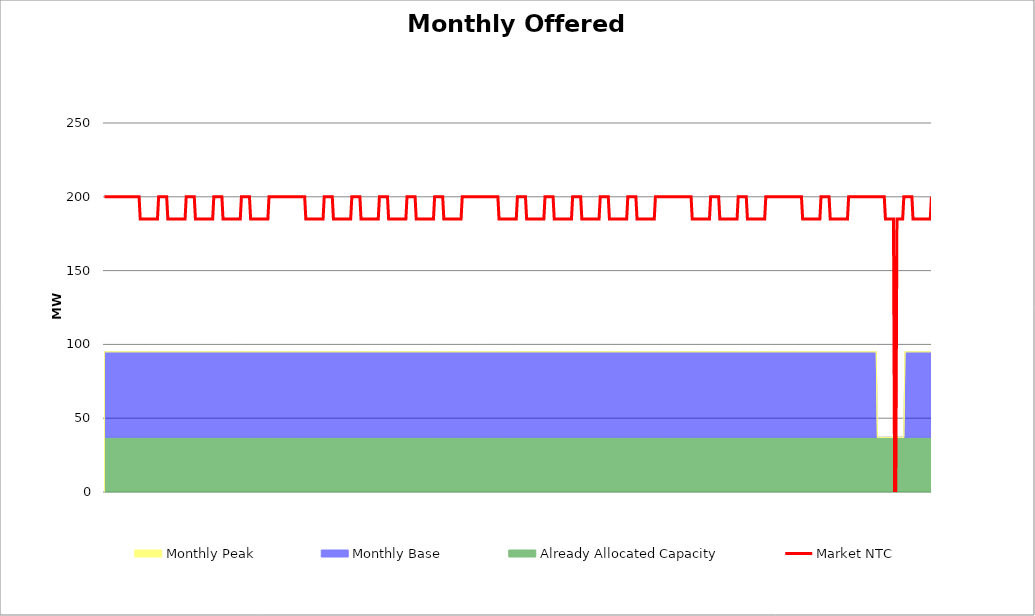
| Category | Market NTC |
|---|---|
| 0 | 200 |
| 1 | 200 |
| 2 | 200 |
| 3 | 200 |
| 4 | 200 |
| 5 | 200 |
| 6 | 200 |
| 7 | 200 |
| 8 | 200 |
| 9 | 200 |
| 10 | 200 |
| 11 | 200 |
| 12 | 200 |
| 13 | 200 |
| 14 | 200 |
| 15 | 200 |
| 16 | 200 |
| 17 | 200 |
| 18 | 200 |
| 19 | 200 |
| 20 | 200 |
| 21 | 200 |
| 22 | 200 |
| 23 | 200 |
| 24 | 200 |
| 25 | 200 |
| 26 | 200 |
| 27 | 200 |
| 28 | 200 |
| 29 | 200 |
| 30 | 200 |
| 31 | 185 |
| 32 | 185 |
| 33 | 185 |
| 34 | 185 |
| 35 | 185 |
| 36 | 185 |
| 37 | 185 |
| 38 | 185 |
| 39 | 185 |
| 40 | 185 |
| 41 | 185 |
| 42 | 185 |
| 43 | 185 |
| 44 | 185 |
| 45 | 185 |
| 46 | 185 |
| 47 | 200 |
| 48 | 200 |
| 49 | 200 |
| 50 | 200 |
| 51 | 200 |
| 52 | 200 |
| 53 | 200 |
| 54 | 200 |
| 55 | 185 |
| 56 | 185 |
| 57 | 185 |
| 58 | 185 |
| 59 | 185 |
| 60 | 185 |
| 61 | 185 |
| 62 | 185 |
| 63 | 185 |
| 64 | 185 |
| 65 | 185 |
| 66 | 185 |
| 67 | 185 |
| 68 | 185 |
| 69 | 185 |
| 70 | 185 |
| 71 | 200 |
| 72 | 200 |
| 73 | 200 |
| 74 | 200 |
| 75 | 200 |
| 76 | 200 |
| 77 | 200 |
| 78 | 200 |
| 79 | 185 |
| 80 | 185 |
| 81 | 185 |
| 82 | 185 |
| 83 | 185 |
| 84 | 185 |
| 85 | 185 |
| 86 | 185 |
| 87 | 185 |
| 88 | 185 |
| 89 | 185 |
| 90 | 185 |
| 91 | 185 |
| 92 | 185 |
| 93 | 185 |
| 94 | 185 |
| 95 | 200 |
| 96 | 200 |
| 97 | 200 |
| 98 | 200 |
| 99 | 200 |
| 100 | 200 |
| 101 | 200 |
| 102 | 200 |
| 103 | 185 |
| 104 | 185 |
| 105 | 185 |
| 106 | 185 |
| 107 | 185 |
| 108 | 185 |
| 109 | 185 |
| 110 | 185 |
| 111 | 185 |
| 112 | 185 |
| 113 | 185 |
| 114 | 185 |
| 115 | 185 |
| 116 | 185 |
| 117 | 185 |
| 118 | 185 |
| 119 | 200 |
| 120 | 200 |
| 121 | 200 |
| 122 | 200 |
| 123 | 200 |
| 124 | 200 |
| 125 | 200 |
| 126 | 200 |
| 127 | 185 |
| 128 | 185 |
| 129 | 185 |
| 130 | 185 |
| 131 | 185 |
| 132 | 185 |
| 133 | 185 |
| 134 | 185 |
| 135 | 185 |
| 136 | 185 |
| 137 | 185 |
| 138 | 185 |
| 139 | 185 |
| 140 | 185 |
| 141 | 185 |
| 142 | 185 |
| 143 | 200 |
| 144 | 200 |
| 145 | 200 |
| 146 | 200 |
| 147 | 200 |
| 148 | 200 |
| 149 | 200 |
| 150 | 200 |
| 151 | 200 |
| 152 | 200 |
| 153 | 200 |
| 154 | 200 |
| 155 | 200 |
| 156 | 200 |
| 157 | 200 |
| 158 | 200 |
| 159 | 200 |
| 160 | 200 |
| 161 | 200 |
| 162 | 200 |
| 163 | 200 |
| 164 | 200 |
| 165 | 200 |
| 166 | 200 |
| 167 | 200 |
| 168 | 200 |
| 169 | 200 |
| 170 | 200 |
| 171 | 200 |
| 172 | 200 |
| 173 | 200 |
| 174 | 200 |
| 175 | 185 |
| 176 | 185 |
| 177 | 185 |
| 178 | 185 |
| 179 | 185 |
| 180 | 185 |
| 181 | 185 |
| 182 | 185 |
| 183 | 185 |
| 184 | 185 |
| 185 | 185 |
| 186 | 185 |
| 187 | 185 |
| 188 | 185 |
| 189 | 185 |
| 190 | 185 |
| 191 | 200 |
| 192 | 200 |
| 193 | 200 |
| 194 | 200 |
| 195 | 200 |
| 196 | 200 |
| 197 | 200 |
| 198 | 200 |
| 199 | 185 |
| 200 | 185 |
| 201 | 185 |
| 202 | 185 |
| 203 | 185 |
| 204 | 185 |
| 205 | 185 |
| 206 | 185 |
| 207 | 185 |
| 208 | 185 |
| 209 | 185 |
| 210 | 185 |
| 211 | 185 |
| 212 | 185 |
| 213 | 185 |
| 214 | 185 |
| 215 | 200 |
| 216 | 200 |
| 217 | 200 |
| 218 | 200 |
| 219 | 200 |
| 220 | 200 |
| 221 | 200 |
| 222 | 200 |
| 223 | 185 |
| 224 | 185 |
| 225 | 185 |
| 226 | 185 |
| 227 | 185 |
| 228 | 185 |
| 229 | 185 |
| 230 | 185 |
| 231 | 185 |
| 232 | 185 |
| 233 | 185 |
| 234 | 185 |
| 235 | 185 |
| 236 | 185 |
| 237 | 185 |
| 238 | 185 |
| 239 | 200 |
| 240 | 200 |
| 241 | 200 |
| 242 | 200 |
| 243 | 200 |
| 244 | 200 |
| 245 | 200 |
| 246 | 200 |
| 247 | 185 |
| 248 | 185 |
| 249 | 185 |
| 250 | 185 |
| 251 | 185 |
| 252 | 185 |
| 253 | 185 |
| 254 | 185 |
| 255 | 185 |
| 256 | 185 |
| 257 | 185 |
| 258 | 185 |
| 259 | 185 |
| 260 | 185 |
| 261 | 185 |
| 262 | 185 |
| 263 | 200 |
| 264 | 200 |
| 265 | 200 |
| 266 | 200 |
| 267 | 200 |
| 268 | 200 |
| 269 | 200 |
| 270 | 200 |
| 271 | 185 |
| 272 | 185 |
| 273 | 185 |
| 274 | 185 |
| 275 | 185 |
| 276 | 185 |
| 277 | 185 |
| 278 | 185 |
| 279 | 185 |
| 280 | 185 |
| 281 | 185 |
| 282 | 185 |
| 283 | 185 |
| 284 | 185 |
| 285 | 185 |
| 286 | 185 |
| 287 | 200 |
| 288 | 200 |
| 289 | 200 |
| 290 | 200 |
| 291 | 200 |
| 292 | 200 |
| 293 | 200 |
| 294 | 200 |
| 295 | 185 |
| 296 | 185 |
| 297 | 185 |
| 298 | 185 |
| 299 | 185 |
| 300 | 185 |
| 301 | 185 |
| 302 | 185 |
| 303 | 185 |
| 304 | 185 |
| 305 | 185 |
| 306 | 185 |
| 307 | 185 |
| 308 | 185 |
| 309 | 185 |
| 310 | 185 |
| 311 | 200 |
| 312 | 200 |
| 313 | 200 |
| 314 | 200 |
| 315 | 200 |
| 316 | 200 |
| 317 | 200 |
| 318 | 200 |
| 319 | 200 |
| 320 | 200 |
| 321 | 200 |
| 322 | 200 |
| 323 | 200 |
| 324 | 200 |
| 325 | 200 |
| 326 | 200 |
| 327 | 200 |
| 328 | 200 |
| 329 | 200 |
| 330 | 200 |
| 331 | 200 |
| 332 | 200 |
| 333 | 200 |
| 334 | 200 |
| 335 | 200 |
| 336 | 200 |
| 337 | 200 |
| 338 | 200 |
| 339 | 200 |
| 340 | 200 |
| 341 | 200 |
| 342 | 200 |
| 343 | 185 |
| 344 | 185 |
| 345 | 185 |
| 346 | 185 |
| 347 | 185 |
| 348 | 185 |
| 349 | 185 |
| 350 | 185 |
| 351 | 185 |
| 352 | 185 |
| 353 | 185 |
| 354 | 185 |
| 355 | 185 |
| 356 | 185 |
| 357 | 185 |
| 358 | 185 |
| 359 | 200 |
| 360 | 200 |
| 361 | 200 |
| 362 | 200 |
| 363 | 200 |
| 364 | 200 |
| 365 | 200 |
| 366 | 200 |
| 367 | 185 |
| 368 | 185 |
| 369 | 185 |
| 370 | 185 |
| 371 | 185 |
| 372 | 185 |
| 373 | 185 |
| 374 | 185 |
| 375 | 185 |
| 376 | 185 |
| 377 | 185 |
| 378 | 185 |
| 379 | 185 |
| 380 | 185 |
| 381 | 185 |
| 382 | 185 |
| 383 | 200 |
| 384 | 200 |
| 385 | 200 |
| 386 | 200 |
| 387 | 200 |
| 388 | 200 |
| 389 | 200 |
| 390 | 200 |
| 391 | 185 |
| 392 | 185 |
| 393 | 185 |
| 394 | 185 |
| 395 | 185 |
| 396 | 185 |
| 397 | 185 |
| 398 | 185 |
| 399 | 185 |
| 400 | 185 |
| 401 | 185 |
| 402 | 185 |
| 403 | 185 |
| 404 | 185 |
| 405 | 185 |
| 406 | 185 |
| 407 | 200 |
| 408 | 200 |
| 409 | 200 |
| 410 | 200 |
| 411 | 200 |
| 412 | 200 |
| 413 | 200 |
| 414 | 200 |
| 415 | 185 |
| 416 | 185 |
| 417 | 185 |
| 418 | 185 |
| 419 | 185 |
| 420 | 185 |
| 421 | 185 |
| 422 | 185 |
| 423 | 185 |
| 424 | 185 |
| 425 | 185 |
| 426 | 185 |
| 427 | 185 |
| 428 | 185 |
| 429 | 185 |
| 430 | 185 |
| 431 | 200 |
| 432 | 200 |
| 433 | 200 |
| 434 | 200 |
| 435 | 200 |
| 436 | 200 |
| 437 | 200 |
| 438 | 200 |
| 439 | 185 |
| 440 | 185 |
| 441 | 185 |
| 442 | 185 |
| 443 | 185 |
| 444 | 185 |
| 445 | 185 |
| 446 | 185 |
| 447 | 185 |
| 448 | 185 |
| 449 | 185 |
| 450 | 185 |
| 451 | 185 |
| 452 | 185 |
| 453 | 185 |
| 454 | 185 |
| 455 | 200 |
| 456 | 200 |
| 457 | 200 |
| 458 | 200 |
| 459 | 200 |
| 460 | 200 |
| 461 | 200 |
| 462 | 200 |
| 463 | 185 |
| 464 | 185 |
| 465 | 185 |
| 466 | 185 |
| 467 | 185 |
| 468 | 185 |
| 469 | 185 |
| 470 | 185 |
| 471 | 185 |
| 472 | 185 |
| 473 | 185 |
| 474 | 185 |
| 475 | 185 |
| 476 | 185 |
| 477 | 185 |
| 478 | 185 |
| 479 | 200 |
| 480 | 200 |
| 481 | 200 |
| 482 | 200 |
| 483 | 200 |
| 484 | 200 |
| 485 | 200 |
| 486 | 200 |
| 487 | 200 |
| 488 | 200 |
| 489 | 200 |
| 490 | 200 |
| 491 | 200 |
| 492 | 200 |
| 493 | 200 |
| 494 | 200 |
| 495 | 200 |
| 496 | 200 |
| 497 | 200 |
| 498 | 200 |
| 499 | 200 |
| 500 | 200 |
| 501 | 200 |
| 502 | 200 |
| 503 | 200 |
| 504 | 200 |
| 505 | 200 |
| 506 | 200 |
| 507 | 200 |
| 508 | 200 |
| 509 | 200 |
| 510 | 200 |
| 511 | 185 |
| 512 | 185 |
| 513 | 185 |
| 514 | 185 |
| 515 | 185 |
| 516 | 185 |
| 517 | 185 |
| 518 | 185 |
| 519 | 185 |
| 520 | 185 |
| 521 | 185 |
| 522 | 185 |
| 523 | 185 |
| 524 | 185 |
| 525 | 185 |
| 526 | 185 |
| 527 | 200 |
| 528 | 200 |
| 529 | 200 |
| 530 | 200 |
| 531 | 200 |
| 532 | 200 |
| 533 | 200 |
| 534 | 200 |
| 535 | 185 |
| 536 | 185 |
| 537 | 185 |
| 538 | 185 |
| 539 | 185 |
| 540 | 185 |
| 541 | 185 |
| 542 | 185 |
| 543 | 185 |
| 544 | 185 |
| 545 | 185 |
| 546 | 185 |
| 547 | 185 |
| 548 | 185 |
| 549 | 185 |
| 550 | 185 |
| 551 | 200 |
| 552 | 200 |
| 553 | 200 |
| 554 | 200 |
| 555 | 200 |
| 556 | 200 |
| 557 | 200 |
| 558 | 200 |
| 559 | 185 |
| 560 | 185 |
| 561 | 185 |
| 562 | 185 |
| 563 | 185 |
| 564 | 185 |
| 565 | 185 |
| 566 | 185 |
| 567 | 185 |
| 568 | 185 |
| 569 | 185 |
| 570 | 185 |
| 571 | 185 |
| 572 | 185 |
| 573 | 185 |
| 574 | 185 |
| 575 | 200 |
| 576 | 200 |
| 577 | 200 |
| 578 | 200 |
| 579 | 200 |
| 580 | 200 |
| 581 | 200 |
| 582 | 200 |
| 583 | 200 |
| 584 | 200 |
| 585 | 200 |
| 586 | 200 |
| 587 | 200 |
| 588 | 200 |
| 589 | 200 |
| 590 | 200 |
| 591 | 200 |
| 592 | 200 |
| 593 | 200 |
| 594 | 200 |
| 595 | 200 |
| 596 | 200 |
| 597 | 200 |
| 598 | 200 |
| 599 | 200 |
| 600 | 200 |
| 601 | 200 |
| 602 | 200 |
| 603 | 200 |
| 604 | 200 |
| 605 | 200 |
| 606 | 200 |
| 607 | 185 |
| 608 | 185 |
| 609 | 185 |
| 610 | 185 |
| 611 | 185 |
| 612 | 185 |
| 613 | 185 |
| 614 | 185 |
| 615 | 185 |
| 616 | 185 |
| 617 | 185 |
| 618 | 185 |
| 619 | 185 |
| 620 | 185 |
| 621 | 185 |
| 622 | 185 |
| 623 | 200 |
| 624 | 200 |
| 625 | 200 |
| 626 | 200 |
| 627 | 200 |
| 628 | 200 |
| 629 | 200 |
| 630 | 200 |
| 631 | 185 |
| 632 | 185 |
| 633 | 185 |
| 634 | 185 |
| 635 | 185 |
| 636 | 185 |
| 637 | 185 |
| 638 | 185 |
| 639 | 185 |
| 640 | 185 |
| 641 | 185 |
| 642 | 185 |
| 643 | 185 |
| 644 | 185 |
| 645 | 185 |
| 646 | 185 |
| 647 | 200 |
| 648 | 200 |
| 649 | 200 |
| 650 | 200 |
| 651 | 200 |
| 652 | 200 |
| 653 | 200 |
| 654 | 200 |
| 655 | 200 |
| 656 | 200 |
| 657 | 200 |
| 658 | 200 |
| 659 | 200 |
| 660 | 200 |
| 661 | 200 |
| 662 | 200 |
| 663 | 200 |
| 664 | 200 |
| 665 | 200 |
| 666 | 200 |
| 667 | 200 |
| 668 | 200 |
| 669 | 200 |
| 670 | 200 |
| 671 | 200 |
| 672 | 200 |
| 673 | 200 |
| 674 | 200 |
| 675 | 200 |
| 676 | 200 |
| 677 | 200 |
| 678 | 200 |
| 679 | 185 |
| 680 | 185 |
| 681 | 185 |
| 682 | 185 |
| 683 | 185 |
| 684 | 185 |
| 685 | 185 |
| 686 | 185 |
| 687 | 0 |
| 688 | 0 |
| 689 | 185 |
| 690 | 185 |
| 691 | 185 |
| 692 | 185 |
| 693 | 185 |
| 694 | 185 |
| 695 | 200 |
| 696 | 200 |
| 697 | 200 |
| 698 | 200 |
| 699 | 200 |
| 700 | 200 |
| 701 | 200 |
| 702 | 200 |
| 703 | 185 |
| 704 | 185 |
| 705 | 185 |
| 706 | 185 |
| 707 | 185 |
| 708 | 185 |
| 709 | 185 |
| 710 | 185 |
| 711 | 185 |
| 712 | 185 |
| 713 | 185 |
| 714 | 185 |
| 715 | 185 |
| 716 | 185 |
| 717 | 185 |
| 718 | 185 |
| 719 | 200 |